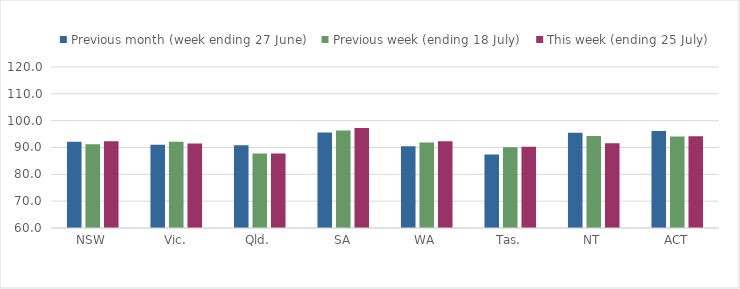
| Category | Previous month (week ending 27 June) | Previous week (ending 18 July) | This week (ending 25 July) |
|---|---|---|---|
| NSW | 92.101 | 91.207 | 92.337 |
| Vic. | 90.987 | 92.151 | 91.481 |
| Qld. | 90.793 | 87.72 | 87.772 |
| SA | 95.618 | 96.355 | 97.254 |
| WA | 90.449 | 91.869 | 92.289 |
| Tas. | 87.434 | 90.079 | 90.262 |
| NT | 95.492 | 94.262 | 91.549 |
| ACT | 96.175 | 94.104 | 94.198 |